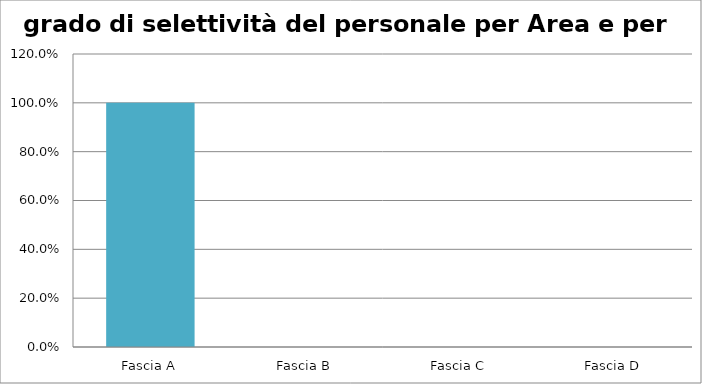
| Category | Totale ente |
|---|---|
| Fascia A | 1 |
| Fascia B | 0 |
| Fascia C | 0 |
| Fascia D | 0 |